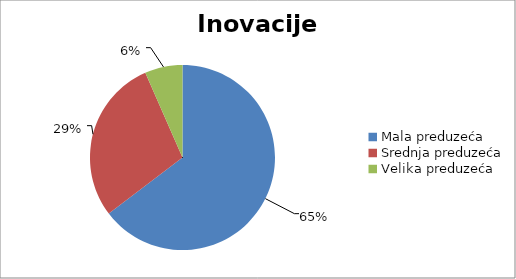
| Category | Inovacije procesa |
|---|---|
| Mala preduzeća | 805.068 |
| Srednja preduzeća | 357.835 |
| Velika preduzeća | 81.966 |